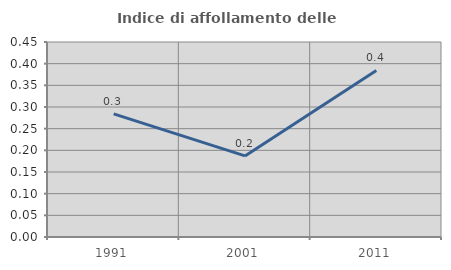
| Category | Indice di affollamento delle abitazioni  |
|---|---|
| 1991.0 | 0.284 |
| 2001.0 | 0.187 |
| 2011.0 | 0.384 |